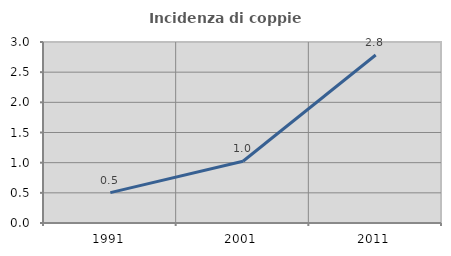
| Category | Incidenza di coppie miste |
|---|---|
| 1991.0 | 0.503 |
| 2001.0 | 1.023 |
| 2011.0 | 2.785 |